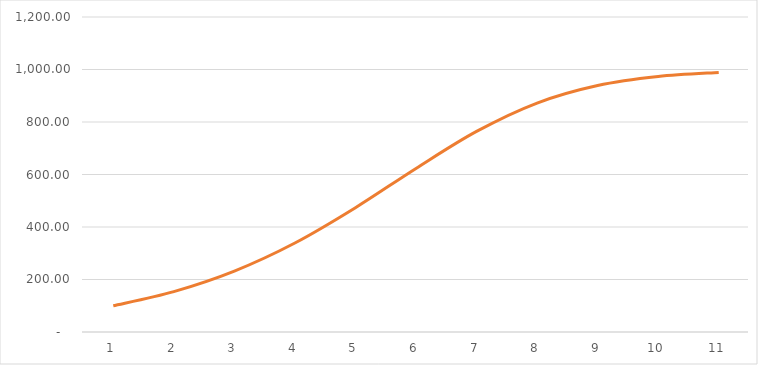
| Category | Sales |
|---|---|
| 0 | 100 |
| 1 | 154 |
| 2 | 232.17 |
| 3 | 339.131 |
| 4 | 473.603 |
| 5 | 623.185 |
| 6 | 764.081 |
| 7 | 872.237 |
| 8 | 939.101 |
| 9 | 973.415 |
| 10 | 988.942 |